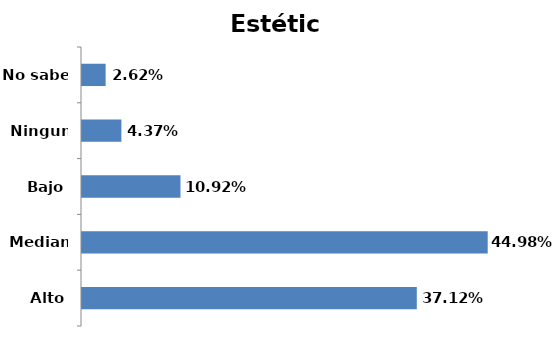
| Category | Series 0 |
|---|---|
| Alto | 0.371 |
| Mediano | 0.45 |
| Bajo | 0.109 |
| Ninguno | 0.044 |
| No sabe | 0.026 |